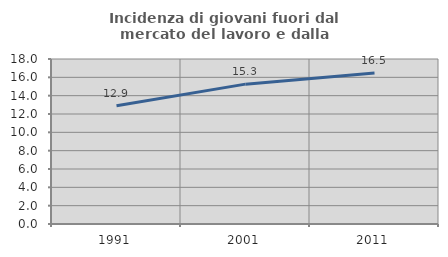
| Category | Incidenza di giovani fuori dal mercato del lavoro e dalla formazione  |
|---|---|
| 1991.0 | 12.903 |
| 2001.0 | 15.257 |
| 2011.0 | 16.462 |